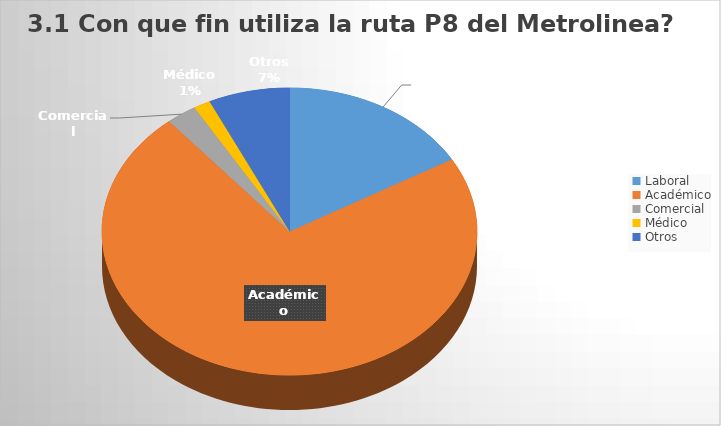
| Category | Series 0 |
|---|---|
| Laboral | 57 |
| Académico | 248 |
| Comercial | 9 |
| Médico | 5 |
| Otros | 24 |